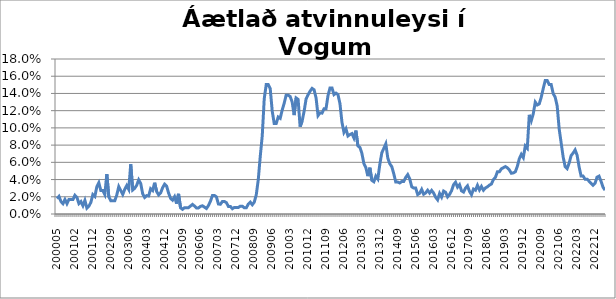
| Category | Series 0 |
|---|---|
| 200005 | 0.018 |
| 200006 | 0.02 |
| 200007 | 0.014 |
| 200008 | 0.012 |
| 200009 | 0.017 |
| 200010 | 0.012 |
| 200011 | 0.017 |
| 200012 | 0.017 |
| 200101 | 0.017 |
| 200102 | 0.022 |
| 200103 | 0.019 |
| 200104 | 0.012 |
| 200105 | 0.014 |
| 200106 | 0.01 |
| 200107 | 0.016 |
| 200109 | 0.007 |
| 200110 | 0.009 |
| 200111 | 0.014 |
| 200112 | 0.023 |
| 200201 | 0.02 |
| 200202 | 0.032 |
| 200203 | 0.036 |
| 200204 | 0.027 |
| 200205 | 0.027 |
| 200206 | 0.023 |
| 200207 | 0.046 |
| 200208 | 0.02 |
| 200209 | 0.015 |
| 200210 | 0.015 |
| 200211 | 0.015 |
| 200212 | 0.022 |
| 200301 | 0.032 |
| 200302 | 0.027 |
| 200303 | 0.023 |
| 200304 | 0.029 |
| 200305 | 0.033 |
| 200306 | 0.029 |
| 200307 | 0.058 |
| 200308 | 0.028 |
| 200309 | 0.03 |
| 200310 | 0.033 |
| 200311 | 0.04 |
| 200312 | 0.035 |
| 200401 | 0.023 |
| 200402 | 0.019 |
| 200403 | 0.021 |
| 200404 | 0.021 |
| 200405 | 0.029 |
| 200406 | 0.027 |
| 200407 | 0.036 |
| 200408 | 0.026 |
| 200409 | 0.022 |
| 200410 | 0.024 |
| 200411 | 0.031 |
| 200412 | 0.035 |
| 200501 | 0.032 |
| 200502 | 0.024 |
| 200503 | 0.018 |
| 200504 | 0.016 |
| 200505 | 0.02 |
| 200506 | 0.012 |
| 200507 | 0.023 |
| 200508 | 0.007 |
| 200509 | 0.005 |
| 200510 | 0.007 |
| 200511 | 0.007 |
| 200512 | 0.007 |
| 200601 | 0.009 |
| 200602 | 0.011 |
| 200603 | 0.009 |
| 200604 | 0.007 |
| 200605 | 0.007 |
| 200606 | 0.009 |
| 200607 | 0.01 |
| 200608 | 0.008 |
| 200609 | 0.006 |
| 200610 | 0.01 |
| 200611 | 0.015 |
| 200612 | 0.021 |
| 200701 | 0.022 |
| 200702 | 0.02 |
| 200703 | 0.012 |
| 200704 | 0.011 |
| 200705 | 0.014 |
| 200706 | 0.014 |
| 200707 | 0.013 |
| 200708 | 0.009 |
| 200709 | 0.009 |
| 200710 | 0.006 |
| 200711 | 0.008 |
| 200712 | 0.008 |
| 200801 | 0.008 |
| 200802 | 0.009 |
| 200803 | 0.009 |
| 200804 | 0.007 |
| 200805 | 0.007 |
| 200806 | 0.012 |
| 200807 | 0.014 |
| 200808 | 0.011 |
| 200809 | 0.014 |
| 200810 | 0.022 |
| 200811 | 0.04 |
| 200812 | 0.067 |
| 200901 | 0.091 |
| 200902 | 0.134 |
| 200903 | 0.15 |
| 200904 | 0.15 |
| 200905 | 0.146 |
| 200906 | 0.12 |
| 200907 | 0.105 |
| 200908 | 0.105 |
| 200909 | 0.113 |
| 200910 | 0.111 |
| 200911 | 0.121 |
| 200912 | 0.129 |
| 201001 | 0.138 |
| 201002 | 0.138 |
| 201003 | 0.136 |
| 201004 | 0.13 |
| 201005 | 0.115 |
| 201006 | 0.135 |
| 201007 | 0.133 |
| 201008 | 0.101 |
| 201009 | 0.108 |
| 201010 | 0.119 |
| 201011 | 0.134 |
| 201012 | 0.138 |
| 201101 | 0.143 |
| 201102 | 0.146 |
| 201103 | 0.144 |
| 201104 | 0.135 |
| 201105 | 0.114 |
| 201106 | 0.117 |
| 201107 | 0.117 |
| 201108 | 0.122 |
| 201109 | 0.122 |
| 201110 | 0.138 |
| 201111 | 0.146 |
| 201112 | 0.146 |
| 201201 | 0.139 |
| 201202 | 0.14 |
| 201203 | 0.139 |
| 201204 | 0.128 |
| 201205 | 0.106 |
| 201206 | 0.095 |
| 201207 | 0.099 |
| 201208 | 0.091 |
| 201209 | 0.092 |
| 201210 | 0.093 |
| 201211 | 0.088 |
| 201212 | 0.097 |
| 201301 | 0.079 |
| 201302 | 0.077 |
| 201303 | 0.07 |
| 201304 | 0.059 |
| 201305 | 0.054 |
| 201306 | 0.044 |
| 201307 | 0.054 |
| 201308 | 0.039 |
| 201309 | 0.037 |
| 201310 | 0.044 |
| 201311 | 0.041 |
| 201312 | 0.058 |
| 201401 | 0.071 |
| 201402 | 0.076 |
| 201403 | 0.081 |
| 201404 | 0.065 |
| 201405 | 0.058 |
| 201406 | 0.055 |
| 201407 | 0.047 |
| 201408 | 0.037 |
| 201409 | 0.037 |
| 201410 | 0.036 |
| 201411 | 0.038 |
| 201412 | 0.038 |
| 201501 | 0.042 |
| 201502 | 0.046 |
| 201503 | 0.041 |
| 201504 | 0.032 |
| 201505 | 0.03 |
| 201506 | 0.03 |
| 201507 | 0.023 |
| 201508 | 0.024 |
| 201509 | 0.029 |
| 201510 | 0.023 |
| 201511 | 0.025 |
| 201512 | 0.028 |
| 201601 | 0.024 |
| 201602 | 0.027 |
| 201603 | 0.024 |
| 201604 | 0.019 |
| 201605 | 0.016 |
| 201606 | 0.024 |
| 201607 | 0.02 |
| 201608 | 0.027 |
| 201609 | 0.025 |
| 201610 | 0.02 |
| 201611 | 0.023 |
| 201612 | 0.027 |
| 201701 | 0.034 |
| 201702 | 0.037 |
| 201703 | 0.031 |
| 201704 | 0.034 |
| 201705 | 0.027 |
| 201706 | 0.025 |
| 201707 | 0.03 |
| 201708 | 0.033 |
| 201709 | 0.026 |
| 201710 | 0.022 |
| 201711 | 0.029 |
| 201712 | 0.028 |
| 201801 | 0.033 |
| 201802 | 0.028 |
| 201803 | 0.032 |
| 201804 | 0.028 |
| 201805 | 0.03 |
| 201806 | 0.032 |
| 201807 | 0.034 |
| 201808 | 0.035 |
| 201809 | 0.04 |
| 201810 | 0.043 |
| 201811 | 0.049 |
| 201812 | 0.049 |
| 201901 | 0.052 |
| 201902 | 0.054 |
| 201903 | 0.055 |
| 201904 | 0.054 |
| 201905 | 0.051 |
| 201906 | 0.047 |
| 201907 | 0.048 |
| 201908 | 0.049 |
| 201909 | 0.055 |
| 201910 | 0.064 |
| 201911 | 0.069 |
| 201912 | 0.065 |
| 202001 | 0.079 |
| 202002 | 0.076 |
| 202003 | 0.115 |
| 202004 | 0.108 |
| 202005 | 0.116 |
| 202006 | 0.13 |
| 202007 | 0.127 |
| 202008 | 0.128 |
| 202009 | 0.136 |
| 202010 | 0.146 |
| 202011 | 0.155 |
| 202012 | 0.155 |
| 202101 | 0.15 |
| 202102 | 0.15 |
| 202103 | 0.14 |
| 202104 | 0.136 |
| 202105 | 0.125 |
| 202106 | 0.099 |
| 202107 | 0.082 |
| 202108 | 0.066 |
| 202109 | 0.055 |
| 202110 | 0.053 |
| 202111 | 0.059 |
| 202112 | 0.068 |
| 202201 | 0.071 |
| 202202 | 0.074 |
| 202203 | 0.068 |
| 202204 | 0.055 |
| 202205 | 0.044 |
| 202206 | 0.044 |
| 202207 | 0.04 |
| 202208 | 0.04 |
| 202209 | 0.038 |
| 202210 | 0.036 |
| 202211 | 0.033 |
| 202212 | 0.036 |
| 202301 | 0.043 |
| 202302 | 0.044 |
| 202303 | 0.038 |
| 202304 | 0.031 |
| 202305 | 0.028 |